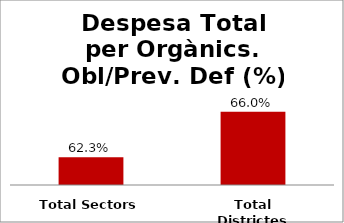
| Category | Series 0 |
|---|---|
| Total Sectors | 0.623 |
| Total Districtes | 0.66 |